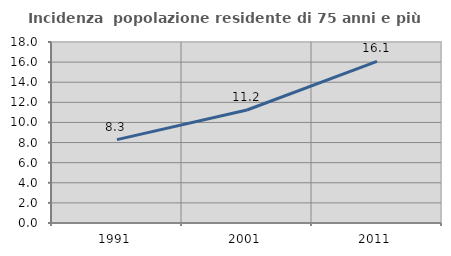
| Category | Incidenza  popolazione residente di 75 anni e più |
|---|---|
| 1991.0 | 8.291 |
| 2001.0 | 11.235 |
| 2011.0 | 16.077 |